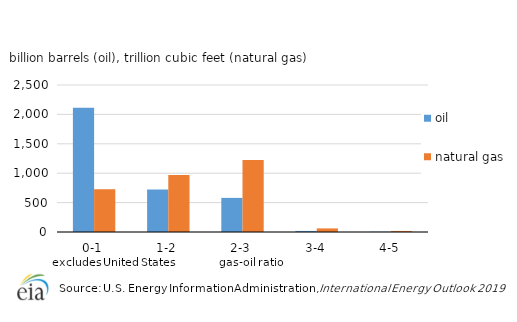
| Category | oil | natural gas |
|---|---|---|
| 0-1 | 2113.461 | 727.944 |
| 1-2 | 722.886 | 970.834 |
| 2-3 | 580.348 | 1223.644 |
| 3-4 | 18.48 | 61.036 |
| 4-5 | 3.712 | 17.688 |